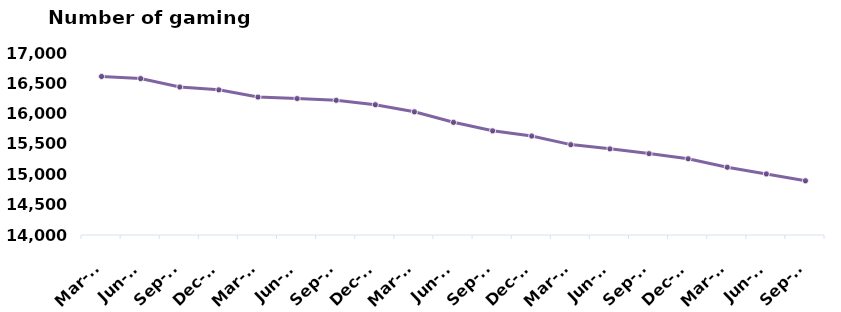
| Category | Total |
|---|---|
| Mar-15 | 16614 |
| Jun-15 | 16579 |
| Sep-15 | 16440 |
| Dec-15 | 16393 |
| Mar-16 | 16274 |
| Jun-16 | 16250 |
| Sep-16 | 16221 |
| Dec-16 | 16148 |
| Mar-17 | 16031 |
| Jun-17 | 15858 |
| Sep-17 | 15717 |
| Dec-17 | 15632 |
| Mar-18 | 15490 |
| Jun-18 | 15420 |
| Sep-18 | 15342 |
| Dec-18 | 15257 |
| Mar-19 | 15118 |
| Jun-19 | 15007 |
| Sep-19 | 14894 |